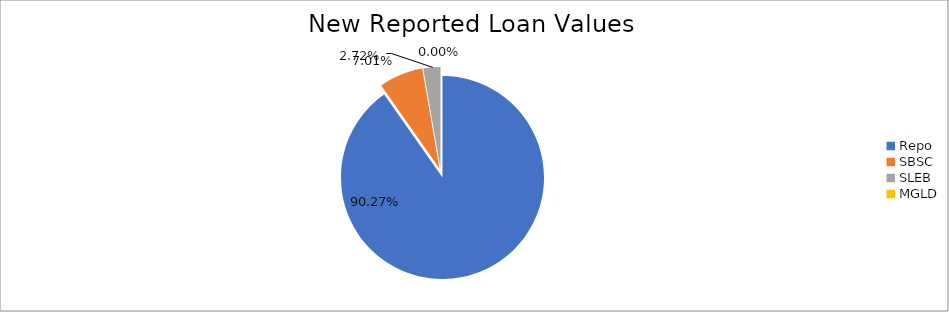
| Category | Series 0 |
|---|---|
| Repo | 10991796.537 |
| SBSC | 853296.778 |
| SLEB | 331703.571 |
| MGLD | 174.195 |